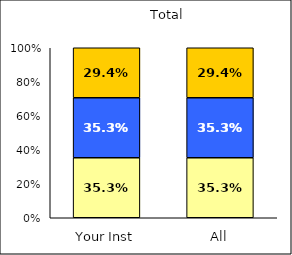
| Category | Low Science Identity | Average Science Identity | High Science Identity |
|---|---|---|---|
| Your Inst | 0.353 | 0.353 | 0.294 |
| All | 0.353 | 0.353 | 0.294 |